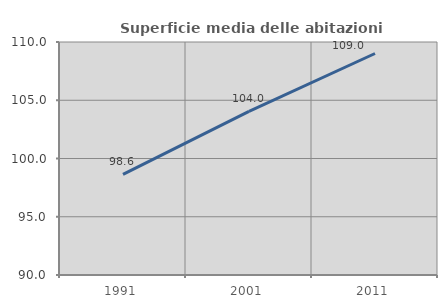
| Category | Superficie media delle abitazioni occupate |
|---|---|
| 1991.0 | 98.637 |
| 2001.0 | 104.048 |
| 2011.0 | 109.012 |